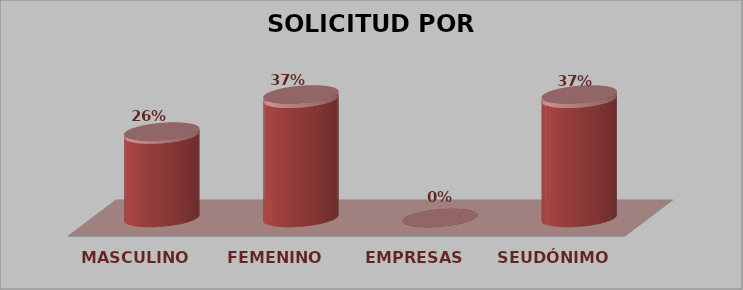
| Category | SOLICITUD POR GÉNERO | Series 1 |
|---|---|---|
| MASCULINO | 7 | 0.259 |
| FEMENINO | 10 | 0.37 |
| EMPRESAS | 0 | 0 |
| SEUDÓNIMO | 10 | 0.37 |